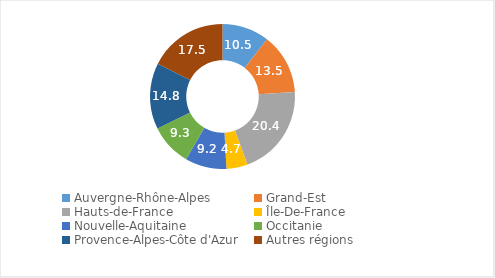
| Category | Series 0 |
|---|---|
| Auvergne-Rhône-Alpes | 10.509 |
| Grand-Est | 13.497 |
| Hauts-de-France | 20.421 |
| Île-De-France | 4.708 |
| Nouvelle-Aquitaine | 9.245 |
| Occitanie | 9.327 |
| Provence-Alpes-Côte d'Azur | 14.758 |
| Autres régions | 17.535 |